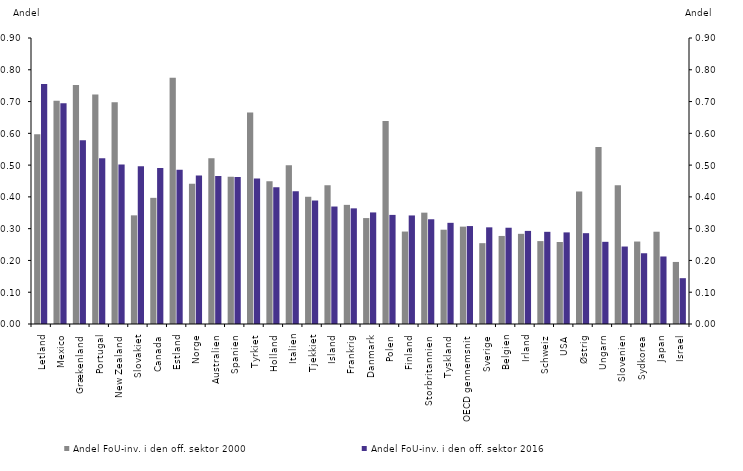
| Category | Andel FoU-inv. i den off. sektor 2000 | Andel FoU-inv. i den off. sektor 2016 |
|---|---|---|
| Letland | 0.597 | 0.755 |
| Mexico | 0.702 | 0.694 |
| Grækenland | 0.752 | 0.578 |
| Portugal | 0.722 | 0.522 |
| New Zealand | 0.698 | 0.502 |
| Slovakiet | 0.342 | 0.496 |
| Canada | 0.397 | 0.491 |
| Estland | 0.775 | 0.485 |
| Norge | 0.441 | 0.467 |
| Australien | 0.522 | 0.466 |
| Spanien | 0.463 | 0.463 |
| Tyrkiet | 0.666 | 0.458 |
| Holland | 0.449 | 0.431 |
| Italien | 0.499 | 0.417 |
| Tjekkiet | 0.4 | 0.389 |
| Island | 0.436 | 0.37 |
| Frankrig | 0.375 | 0.364 |
| Danmark | 0.333 | 0.351 |
| Polen | 0.639 | 0.343 |
| Finland | 0.291 | 0.342 |
| Storbritannien  | 0.35 | 0.33 |
| Tyskland | 0.297 | 0.318 |
| OECD gennemsnit | 0.306 | 0.308 |
| Sverige | 0.254 | 0.304 |
| Belgien | 0.277 | 0.303 |
| Irland | 0.284 | 0.293 |
| Schweiz | 0.261 | 0.29 |
| USA | 0.258 | 0.288 |
| Østrig | 0.417 | 0.286 |
| Ungarn | 0.557 | 0.259 |
| Slovenien | 0.437 | 0.244 |
| Sydkorea | 0.26 | 0.223 |
| Japan | 0.29 | 0.212 |
| Israel | 0.195 | 0.144 |